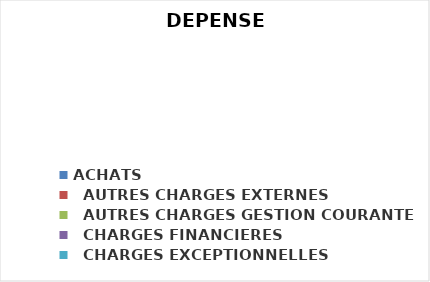
| Category | Series 0 |
|---|---|
| ACHATS | 0 |
|   AUTRES CHARGES EXTERNES | 0 |
|   AUTRES CHARGES GESTION COURANTE | 0 |
|   CHARGES FINANCIERES | 0 |
|   CHARGES EXCEPTIONNELLES | 0 |